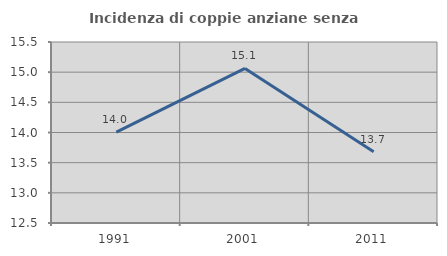
| Category | Incidenza di coppie anziane senza figli  |
|---|---|
| 1991.0 | 14.006 |
| 2001.0 | 15.062 |
| 2011.0 | 13.682 |